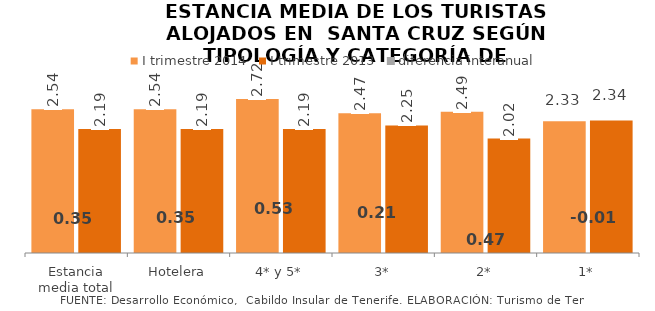
| Category | I trimestre 2014 | I trimestre 2013 |
|---|---|---|
| Estancia media total | 2.539 | 2.189 |
| Hotelera | 2.539 | 2.189 |
| 4* y 5* | 2.72 | 2.186 |
| 3* | 2.466 | 2.251 |
| 2* | 2.491 | 2.02 |
| 1* | 2.325 | 2.34 |